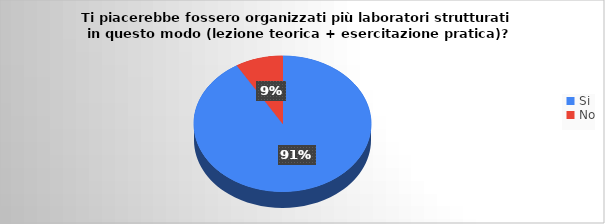
| Category | Series 0 |
|---|---|
| Si | 53 |
| No | 5 |